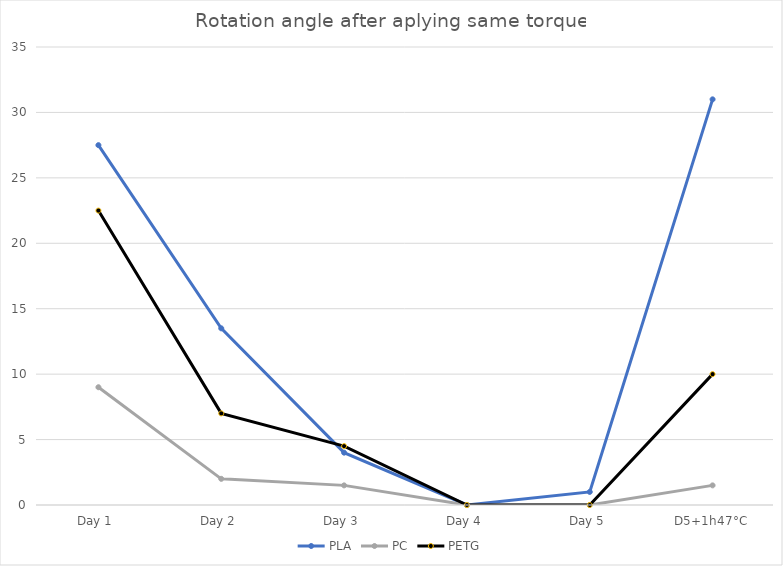
| Category | PLA | PC | PETG |
|---|---|---|---|
| Day 1 | 27.5 | 9 | 22.5 |
| Day 2 | 13.5 | 2 | 7 |
| Day 3 | 4 | 1.5 | 4.5 |
| Day 4 | 0 | 0 | 0 |
| Day 5 | 1 | 0 | 0 |
| D5+1h47°C | 31 | 1.5 | 10 |